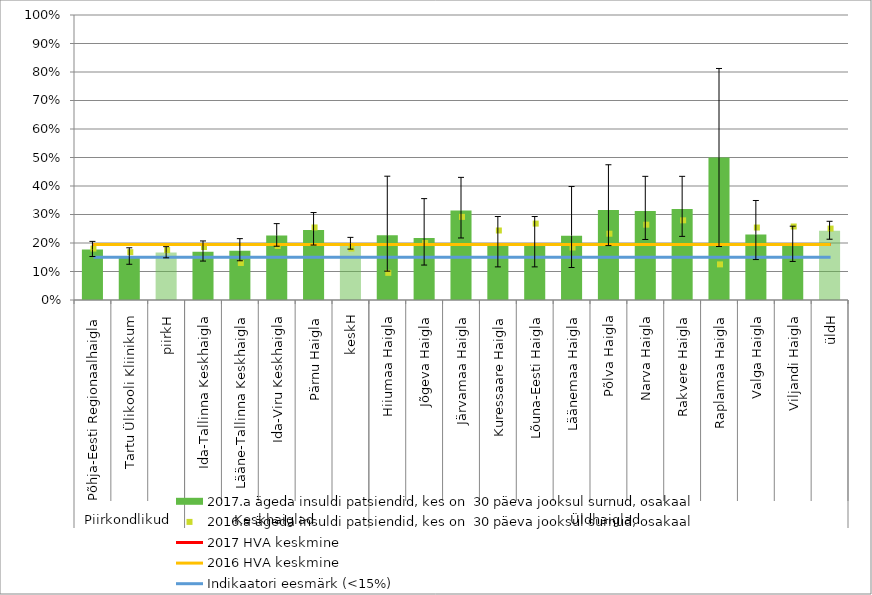
| Category | 2017.a ägeda insuldi patsiendid, kes on  30 päeva jooksul surnud, osakaal |
|---|---|
| 0 | 0.178 |
| 1 | 0.152 |
| 2 | 0.167 |
| 3 | 0.169 |
| 4 | 0.173 |
| 5 | 0.226 |
| 6 | 0.245 |
| 7 | 0.198 |
| 8 | 0.227 |
| 9 | 0.217 |
| 10 | 0.314 |
| 11 | 0.189 |
| 12 | 0.189 |
| 13 | 0.226 |
| 14 | 0.316 |
| 15 | 0.312 |
| 16 | 0.319 |
| 17 | 0.5 |
| 18 | 0.23 |
| 19 | 0.19 |
| 20 | 0.243 |